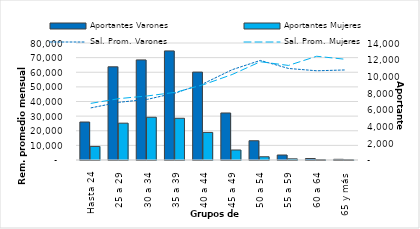
| Category | Aportantes Varones | Aportantes Mujeres |
|---|---|---|
| Hasta 24 | 4545 | 1624 |
| 25 a 29 | 11149 | 4408 |
| 30 a 34 | 11977 | 5117 |
| 35 a 39 | 13053 | 4993 |
| 40 a 44 | 10517 | 3301 |
| 45 a 49 | 5626 | 1198 |
| 50 a 54 | 2304 | 386 |
| 55 a 59 | 597 | 138 |
| 60 a 64 | 176 | 40 |
| 65 y más | 82 | 29 |